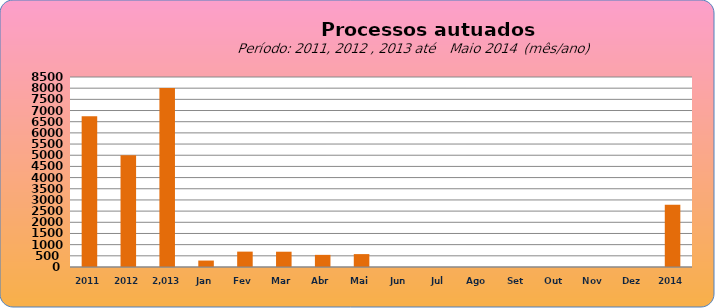
| Category | 6749 4998  8.003   288  688 684 543 577 0 0 0 0 0 0 0 |
|---|---|
| 2011 | 6749 |
| 2012 | 4998 |
|  2.013  | 8003 |
| Jan | 288 |
| Fev | 688 |
| Mar | 684 |
| Abr | 543 |
| Mai | 577 |
| Jun | 0 |
| Jul | 0 |
| Ago | 0 |
| Set | 0 |
| Out | 0 |
| Nov | 0 |
| Dez | 0 |
| 2014 | 2780 |